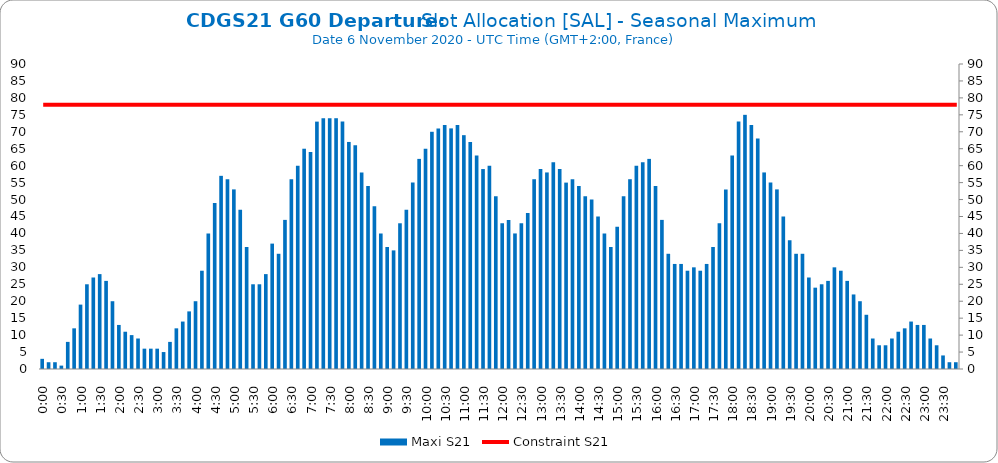
| Category | Maxi S21 |
|---|---|
| 0.0 | 3 |
| 0.006944444444444444 | 2 |
| 0.013888888888888888 | 2 |
| 0.020833333333333332 | 1 |
| 0.027777777777777776 | 8 |
| 0.034722222222222224 | 12 |
| 0.041666666666666664 | 19 |
| 0.04861111111111111 | 25 |
| 0.05555555555555555 | 27 |
| 0.0625 | 28 |
| 0.06944444444444443 | 26 |
| 0.0763888888888889 | 20 |
| 0.08333333333333333 | 13 |
| 0.09027777777777778 | 11 |
| 0.09722222222222222 | 10 |
| 0.10416666666666667 | 9 |
| 0.1111111111111111 | 6 |
| 0.11805555555555557 | 6 |
| 0.125 | 6 |
| 0.13194444444444445 | 5 |
| 0.1388888888888889 | 8 |
| 0.14583333333333334 | 12 |
| 0.15277777777777776 | 14 |
| 0.15972222222222224 | 17 |
| 0.16666666666666666 | 20 |
| 0.17361111111111113 | 29 |
| 0.18055555555555555 | 40 |
| 0.1875 | 49 |
| 0.19444444444444445 | 57 |
| 0.20138888888888887 | 56 |
| 0.20833333333333334 | 53 |
| 0.2152777777777778 | 47 |
| 0.2222222222222222 | 36 |
| 0.22916666666666666 | 25 |
| 0.23611111111111113 | 25 |
| 0.24305555555555555 | 28 |
| 0.25 | 37 |
| 0.2569444444444445 | 34 |
| 0.2638888888888889 | 44 |
| 0.2708333333333333 | 56 |
| 0.2777777777777778 | 60 |
| 0.2847222222222222 | 65 |
| 0.2916666666666667 | 64 |
| 0.2986111111111111 | 73 |
| 0.3055555555555555 | 74 |
| 0.3125 | 74 |
| 0.3194444444444445 | 74 |
| 0.3263888888888889 | 73 |
| 0.3333333333333333 | 67 |
| 0.34027777777777773 | 66 |
| 0.34722222222222227 | 58 |
| 0.3541666666666667 | 54 |
| 0.3611111111111111 | 48 |
| 0.3680555555555556 | 40 |
| 0.375 | 36 |
| 0.3819444444444444 | 35 |
| 0.3888888888888889 | 43 |
| 0.3958333333333333 | 47 |
| 0.40277777777777773 | 55 |
| 0.40972222222222227 | 62 |
| 0.4166666666666667 | 65 |
| 0.4236111111111111 | 70 |
| 0.4305555555555556 | 71 |
| 0.4375 | 72 |
| 0.4444444444444444 | 71 |
| 0.4513888888888889 | 72 |
| 0.4583333333333333 | 69 |
| 0.46527777777777773 | 67 |
| 0.47222222222222227 | 63 |
| 0.4791666666666667 | 59 |
| 0.4861111111111111 | 60 |
| 0.4930555555555556 | 51 |
| 0.5 | 43 |
| 0.5069444444444444 | 44 |
| 0.513888888888889 | 40 |
| 0.5208333333333334 | 43 |
| 0.5277777777777778 | 46 |
| 0.5347222222222222 | 56 |
| 0.5416666666666666 | 59 |
| 0.548611111111111 | 58 |
| 0.5555555555555556 | 61 |
| 0.5625 | 59 |
| 0.5694444444444444 | 55 |
| 0.576388888888889 | 56 |
| 0.5833333333333334 | 54 |
| 0.5902777777777778 | 51 |
| 0.5972222222222222 | 50 |
| 0.6041666666666666 | 45 |
| 0.611111111111111 | 40 |
| 0.6180555555555556 | 36 |
| 0.625 | 42 |
| 0.6319444444444444 | 51 |
| 0.638888888888889 | 56 |
| 0.6458333333333334 | 60 |
| 0.6527777777777778 | 61 |
| 0.6597222222222222 | 62 |
| 0.6666666666666666 | 54 |
| 0.6736111111111112 | 44 |
| 0.6805555555555555 | 34 |
| 0.6875 | 31 |
| 0.6944444444444445 | 31 |
| 0.7013888888888888 | 29 |
| 0.7083333333333334 | 30 |
| 0.7152777777777778 | 29 |
| 0.7222222222222222 | 31 |
| 0.7291666666666666 | 36 |
| 0.7361111111111112 | 43 |
| 0.7430555555555555 | 53 |
| 0.75 | 63 |
| 0.7569444444444445 | 73 |
| 0.7638888888888888 | 75 |
| 0.7708333333333334 | 72 |
| 0.7777777777777778 | 68 |
| 0.7847222222222222 | 58 |
| 0.7916666666666666 | 55 |
| 0.7986111111111112 | 53 |
| 0.8055555555555555 | 45 |
| 0.8125 | 38 |
| 0.8194444444444445 | 34 |
| 0.8263888888888888 | 34 |
| 0.8333333333333334 | 27 |
| 0.8402777777777778 | 24 |
| 0.8472222222222222 | 25 |
| 0.8541666666666666 | 26 |
| 0.8611111111111112 | 30 |
| 0.8680555555555555 | 29 |
| 0.875 | 26 |
| 0.8819444444444445 | 22 |
| 0.8888888888888888 | 20 |
| 0.8958333333333334 | 16 |
| 0.9027777777777778 | 9 |
| 0.9097222222222222 | 7 |
| 0.9166666666666666 | 7 |
| 0.9236111111111112 | 9 |
| 0.9305555555555555 | 11 |
| 0.9375 | 12 |
| 0.9444444444444445 | 14 |
| 0.9513888888888888 | 13 |
| 0.9583333333333334 | 13 |
| 0.9652777777777778 | 9 |
| 0.9722222222222222 | 7 |
| 0.9791666666666666 | 4 |
| 0.9861111111111112 | 2 |
| 0.9930555555555555 | 2 |